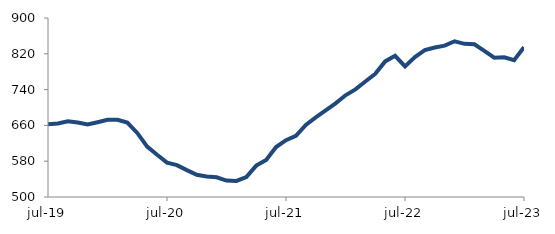
| Category | Series 0 |
|---|---|
| 2019-07-01 | 662.49 |
| 2019-08-01 | 664.104 |
| 2019-09-01 | 669.196 |
| 2019-10-01 | 666.5 |
| 2019-11-01 | 662.174 |
| 2019-12-01 | 667.143 |
| 2020-01-01 | 672.455 |
| 2020-02-01 | 672.659 |
| 2020-03-01 | 666.213 |
| 2020-04-01 | 643.145 |
| 2020-05-01 | 612.572 |
| 2020-06-01 | 594.292 |
| 2020-07-01 | 576.858 |
| 2020-08-01 | 571.224 |
| 2020-09-01 | 560.032 |
| 2020-10-01 | 549.541 |
| 2020-11-01 | 545.982 |
| 2020-12-01 | 544.038 |
| 2021-01-01 | 536.772 |
| 2021-02-01 | 535.938 |
| 2021-03-01 | 544.717 |
| 2021-04-01 | 570.16 |
| 2021-05-01 | 582.981 |
| 2021-06-01 | 611.684 |
| 2021-07-01 | 627.037 |
| 2021-08-01 | 636.642 |
| 2021-09-01 | 661.114 |
| 2021-10-01 | 677.889 |
| 2021-11-01 | 693.389 |
| 2021-12-01 | 709.343 |
| 2022-01-01 | 727.31 |
| 2022-02-01 | 740.539 |
| 2022-03-01 | 758.027 |
| 2022-04-01 | 775.241 |
| 2022-05-01 | 802.956 |
| 2022-06-01 | 815.434 |
| 2022-07-01 | 791.89 |
| 2022-08-01 | 812.76 |
| 2022-09-01 | 828.12 |
| 2022-10-01 | 834 |
| 2022-11-01 | 838.178 |
| 2022-12-01 | 847.954 |
| 2023-01-01 | 842.285 |
| 2023-02-01 | 841.25 |
| 2023-03-01 | 826.38 |
| 2023-04-01 | 811.394 |
| 2023-05-01 | 812.228 |
| 2023-06-01 | 805.926 |
| 2023-07-01 | 834.815 |